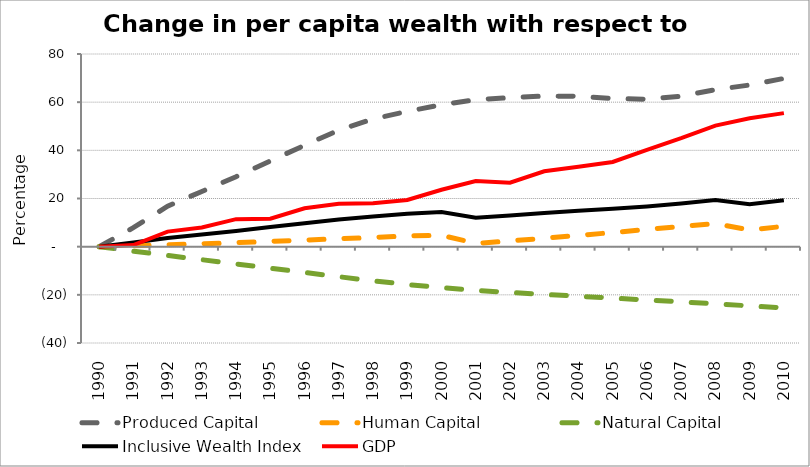
| Category | Produced Capital  | Human Capital | Natural Capital | Inclusive Wealth Index | GDP |
|---|---|---|---|---|---|
| 1990.0 | 0 | 0 | 0 | 0 | 0 |
| 1991.0 | 7.876 | 0.375 | -1.856 | 1.715 | 0.68 |
| 1992.0 | 16.816 | 0.732 | -3.651 | 3.609 | 6.258 |
| 1993.0 | 22.92 | 1.198 | -5.411 | 5.078 | 7.955 |
| 1994.0 | 29.061 | 1.657 | -7.166 | 6.548 | 11.433 |
| 1995.0 | 35.603 | 2.184 | -8.926 | 8.145 | 11.599 |
| 1996.0 | 42.091 | 2.724 | -10.706 | 9.744 | 15.917 |
| 1997.0 | 48.388 | 3.277 | -12.481 | 11.319 | 17.776 |
| 1998.0 | 53.027 | 3.8 | -14.177 | 12.569 | 17.986 |
| 1999.0 | 56.161 | 4.432 | -15.708 | 13.638 | 19.4 |
| 2000.0 | 58.915 | 4.747 | -17.025 | 14.381 | 23.649 |
| 2001.0 | 61.052 | 1.352 | -18.119 | 12.005 | 27.252 |
| 2002.0 | 61.857 | 2.369 | -19.032 | 12.969 | 26.574 |
| 2003.0 | 62.545 | 3.497 | -19.825 | 14.003 | 31.289 |
| 2004.0 | 62.441 | 4.675 | -20.577 | 14.934 | 33.162 |
| 2005.0 | 61.498 | 5.871 | -21.343 | 15.728 | 35.182 |
| 2006.0 | 61.219 | 7.13 | -22.138 | 16.694 | 40.218 |
| 2007.0 | 62.488 | 8.361 | -22.945 | 17.916 | 45.032 |
| 2008.0 | 65.207 | 9.573 | -23.763 | 19.386 | 50.284 |
| 2009.0 | 67.125 | 6.931 | -24.582 | 17.582 | 53.296 |
| 2010.0 | 69.851 | 8.442 | -25.396 | 19.296 | 55.443 |